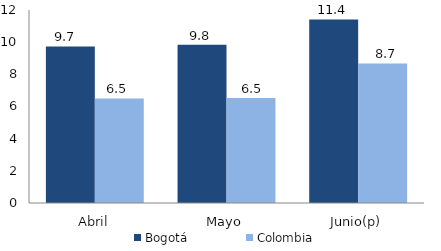
| Category | Bogotá | Colombia |
|---|---|---|
| Abril | 9.732 | 6.499 |
| Mayo | 9.839 | 6.528 |
| Junio(p) | 11.41 | 8.677 |